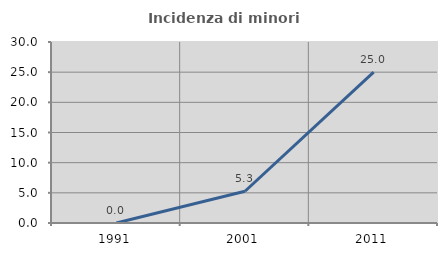
| Category | Incidenza di minori stranieri |
|---|---|
| 1991.0 | 0 |
| 2001.0 | 5.263 |
| 2011.0 | 25 |